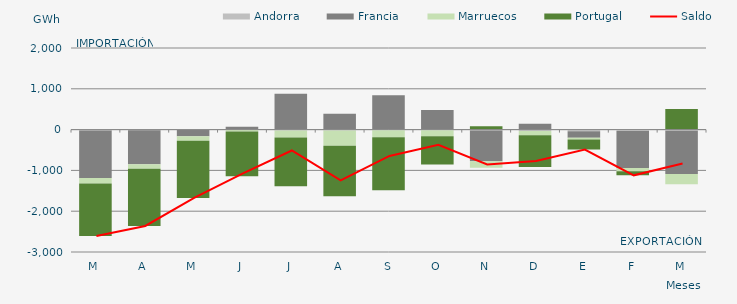
| Category | Andorra | Francia | Marruecos | Portugal |
|---|---|---|---|---|
| M | -23.108 | -1163.333 | -133.704 | -1286.701 |
| A | -14.627 | -836.505 | -105.478 | -1404.431 |
| M | -10.909 | -149.423 | -115.706 | -1398.852 |
| J | -2.08 | 70.4 | -42.701 | -1096.73 |
| J | -19.231 | 877.054 | -174.716 | -1194.709 |
| A | -19.938 | 386.697 | -376.794 | -1234.348 |
| S | -15.222 | 839.308 | -170.976 | -1297.757 |
| O | -13.493 | 479.877 | -148.522 | -692.604 |
| N | -23.834 | -750.522 | -163.216 | 84.596 |
| D | -34.648 | 145.481 | -106.176 | -774.962 |
| E | -40.623 | -161.618 | -38.221 | -248.586 |
| F | -34.3 | -904.751 | -79.926 | -101.643 |
| M | -27.324 | -1059.175 | -252.596 | 506.03 |